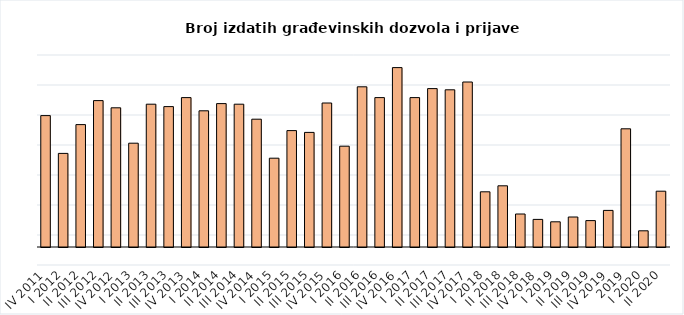
| Category | Broj izdatih građevinskih dozvola i prijava radova |
|---|---|
| IV 2011 | 219 |
| I 2012 | 156 |
| II 2012 | 204 |
| III 2012 | 244 |
| IV 2012 | 232 |
| I 2013 | 173 |
| II 2013 | 238 |
| III 2013 | 234 |
| IV 2013 | 249 |
| I 2014 | 227 |
| II 2014 | 239 |
| III 2014 | 238 |
| IV 2014 | 213 |
| I 2015 | 148 |
| II 2015 | 194 |
| III 2015 | 191 |
| IV 2015 | 240 |
| I 2016 | 168 |
| II 2016 | 267 |
| III 2016 | 249 |
| IV 2016 | 299 |
| I 2017 | 249 |
| II 2017 | 264 |
| III 2017 | 262 |
| IV 2017 | 275 |
| I 2018 | 92 |
| II 2018 | 102 |
| III 2018 | 55 |
| IV 2018 | 46 |
| I 2019 | 42 |
| II 2019 | 50 |
| III 2019 | 44 |
| IV 2019 | 61 |
| 2019 | 197 |
| I 2020 | 27 |
| II 2020 | 93 |